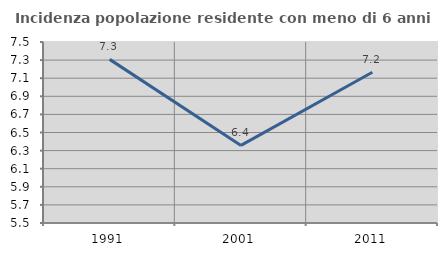
| Category | Incidenza popolazione residente con meno di 6 anni |
|---|---|
| 1991.0 | 7.308 |
| 2001.0 | 6.357 |
| 2011.0 | 7.166 |